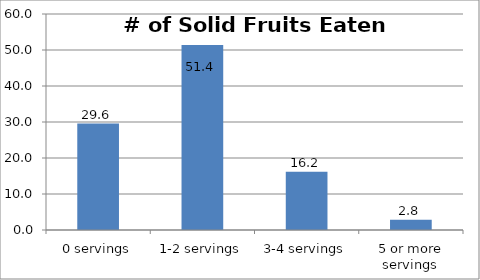
| Category | Series 0 |
|---|---|
| 0 servings | 29.567 |
| 1-2 servings | 51.387 |
| 3-4 servings | 16.206 |
| 5 or more servings | 2.841 |